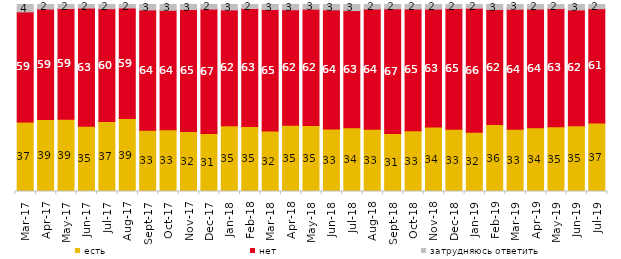
| Category | есть | нет | затрудняюсь ответить |
|---|---|---|---|
| 2017-03-01 | 37.2 | 58.85 | 3.95 |
| 2017-04-01 | 38.5 | 59.1 | 2.4 |
| 2017-05-01 | 38.7 | 59.15 | 2.15 |
| 2017-06-01 | 34.95 | 63.15 | 1.9 |
| 2017-07-01 | 37.4 | 60.35 | 2.25 |
| 2017-08-01 | 39 | 59.15 | 1.85 |
| 2017-09-01 | 32.8 | 64.3 | 2.9 |
| 2017-10-01 | 33 | 63.9 | 3.1 |
| 2017-11-01 | 32.1 | 65.15 | 2.7 |
| 2017-12-01 | 30.95 | 66.6 | 2.45 |
| 2018-01-01 | 35.2 | 61.9 | 2.9 |
| 2018-02-01 | 34.8 | 63.05 | 2.15 |
| 2018-03-01 | 32.35 | 64.95 | 2.7 |
| 2018-04-01 | 35.45 | 61.75 | 2.8 |
| 2018-05-01 | 35.3 | 62.15 | 2.5 |
| 2018-06-01 | 33.45 | 63.7 | 2.85 |
| 2018-07-01 | 34.05 | 62.7 | 3.25 |
| 2018-08-01 | 33.3 | 64.3 | 2.4 |
| 2018-09-01 | 31 | 66.7 | 2.3 |
| 2018-10-01 | 32.55 | 65.05 | 2.4 |
| 2018-11-01 | 34.431 | 63.124 | 2.445 |
| 2018-12-01 | 33.25 | 64.6 | 2.15 |
| 2019-01-01 | 31.75 | 66.25 | 2 |
| 2019-02-01 | 35.8 | 61.5 | 2.7 |
| 2019-03-01 | 33.317 | 64.147 | 2.536 |
| 2019-04-01 | 34.059 | 63.515 | 2.426 |
| 2019-05-01 | 34.621 | 63.2 | 2.179 |
| 2019-06-01 | 35.162 | 61.945 | 2.893 |
| 2019-07-01 | 36.634 | 61.139 | 2.228 |